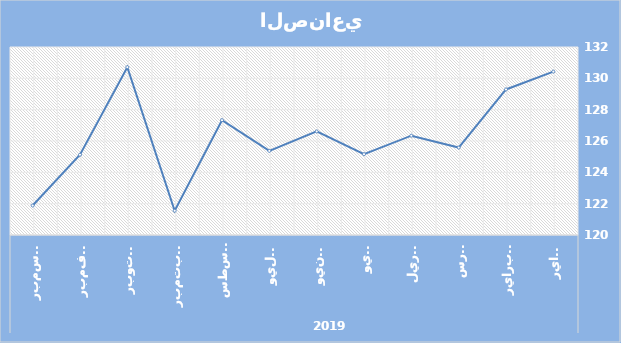
| Category | الرقم القياسي |
|---|---|
| 0 | 130.43 |
| 1 | 129.29 |
| 2 | 125.58 |
| 3 | 126.34 |
| 4 | 125.16 |
| 5 | 126.61 |
| 6 | 125.37 |
| 7 | 127.33 |
| 8 | 121.55 |
| 9 | 130.713 |
| 10 | 125.12 |
| 11 | 121.88 |